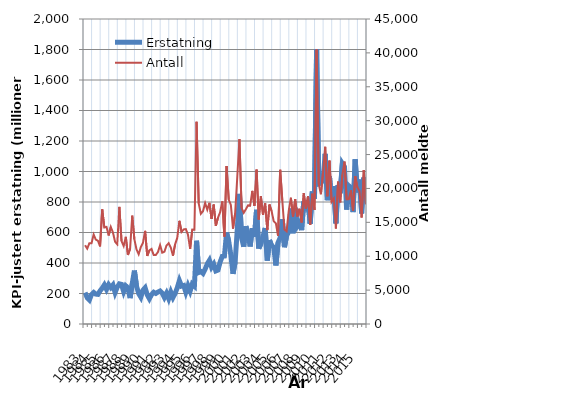
| Category | Erstatning |
|---|---|
| 1983.0 | 205.859 |
| nan | 172.439 |
| nan | 157.695 |
| nan | 193.17 |
| 1984.0 | 207.142 |
| nan | 195.941 |
| nan | 194.272 |
| nan | 217.294 |
| 1985.0 | 234.815 |
| nan | 256.66 |
| nan | 227.431 |
| nan | 257.937 |
| 1986.0 | 239.147 |
| nan | 255.898 |
| nan | 205.963 |
| nan | 241.024 |
| 1987.0 | 263.314 |
| nan | 259.842 |
| nan | 212.64 |
| nan | 250.177 |
| 1988.0 | 238.119 |
| nan | 169.742 |
| nan | 264.377 |
| nan | 350.226 |
| 1989.0 | 247.426 |
| nan | 199.98 |
| nan | 175.966 |
| nan | 222 |
| 1990.0 | 237.704 |
| nan | 191.233 |
| nan | 165.85 |
| nan | 193.043 |
| 1991.0 | 208.312 |
| nan | 200.291 |
| nan | 209.618 |
| nan | 216.719 |
| 1992.0 | 202.456 |
| nan | 174.447 |
| nan | 201.569 |
| nan | 166.334 |
| 1993.0 | 208.704 |
| nan | 173.688 |
| nan | 200.666 |
| nan | 237.394 |
| 1994.0 | 284.331 |
| nan | 248.57 |
| nan | 252.544 |
| nan | 208.159 |
| 1995.0 | 250.788 |
| nan | 215.752 |
| nan | 262.161 |
| nan | 248.909 |
| 1996.0 | 545.856 |
| nan | 338.003 |
| nan | 344.042 |
| nan | 331.801 |
| 1997.0 | 359.204 |
| nan | 394.166 |
| nan | 417.426 |
| nan | 372.44 |
| 1998.0 | 392.915 |
| nan | 348.086 |
| nan | 353.773 |
| nan | 406.622 |
| 1999.0 | 443.507 |
| nan | 445.662 |
| nan | 599.695 |
| nan | 543.103 |
| 2000.0 | 452.712 |
| nan | 328.768 |
| nan | 407.58 |
| nan | 621.434 |
| 2001.0 | 852.847 |
| nan | 564.588 |
| nan | 507.075 |
| nan | 641.553 |
| 2002.0 | 584.299 |
| nan | 508.397 |
| nan | 628.291 |
| nan | 572.513 |
| 2003.0 | 748.769 |
| nan | 495.059 |
| nan | 526.68 |
| nan | 573.74 |
| 2004.0 | 629.424 |
| nan | 416.133 |
| nan | 550.144 |
| nan | 514.216 |
| 2005.0 | 503.291 |
| nan | 384.081 |
| nan | 533.208 |
| nan | 565.067 |
| 2006.0 | 686.848 |
| nan | 503.708 |
| nan | 579.578 |
| nan | 604.661 |
| 2007.0 | 756.853 |
| nan | 595.046 |
| nan | 760.271 |
| nan | 642.795 |
| 2008.0 | 664.734 |
| nan | 615.377 |
| nan | 803.718 |
| nan | 771.888 |
| 2009.0 | 810.01 |
| nan | 657.599 |
| nan | 868.671 |
| nan | 821.076 |
| 2010.0 | 1801.107 |
| nan | 918.654 |
| nan | 923.074 |
| nan | 944.344 |
| 2011.0 | 1116.041 |
| nan | 811.559 |
| nan | 967.659 |
| nan | 815.509 |
| 2012.0 | 903.472 |
| nan | 660.521 |
| nan | 910.673 |
| nan | 857.485 |
| 2013.0 | 1053.081 |
| nan | 1031.165 |
| nan | 750.323 |
| nan | 906.303 |
| 2014.0 | 893.859 |
| nan | 734.034 |
| nan | 1079.804 |
| nan | 863.368 |
| 2015.0 | 947.227 |
| nan | 725.409 |
| nan | 960.235 |
| nan | 852.579 |